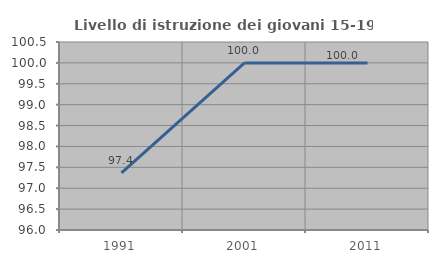
| Category | Livello di istruzione dei giovani 15-19 anni |
|---|---|
| 1991.0 | 97.368 |
| 2001.0 | 100 |
| 2011.0 | 100 |